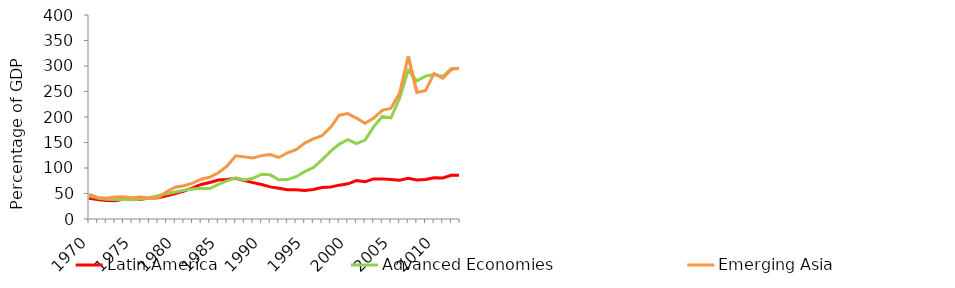
| Category | Latin America | Advanced Economies | Emerging Asia |
|---|---|---|---|
| 1970.0 | 40.739 | 45.427 | 48.295 |
| 1971.0 | 38.263 | 40.887 | 42.381 |
| 1972.0 | 36.474 | 38.635 | 40.748 |
| 1973.0 | 35.725 | 38.225 | 43.373 |
| 1974.0 | 38.863 | 38.237 | 43.654 |
| 1975.0 | 39.211 | 37.572 | 41.906 |
| 1976.0 | 38.292 | 39.385 | 43.041 |
| 1977.0 | 41.395 | 41.589 | 40.756 |
| 1978.0 | 41.713 | 45.764 | 41.584 |
| 1979.0 | 45.435 | 49.615 | 53.458 |
| 1980.0 | 49.704 | 53.043 | 62.329 |
| 1981.0 | 54.597 | 56.431 | 65.181 |
| 1982.0 | 60.89 | 58.783 | 70.415 |
| 1983.0 | 67.716 | 60.485 | 78.037 |
| 1984.0 | 71.686 | 59.729 | 81.986 |
| 1985.0 | 76.553 | 67.737 | 90.757 |
| 1986.0 | 77.595 | 74.651 | 103.715 |
| 1987.0 | 79.749 | 80.755 | 123.784 |
| 1988.0 | 75.418 | 76.571 | 121.798 |
| 1989.0 | 71.315 | 79.772 | 119.489 |
| 1990.0 | 67.733 | 87.733 | 124.307 |
| 1991.0 | 62.986 | 86.573 | 126.217 |
| 1992.0 | 60.257 | 76.962 | 120.651 |
| 1993.0 | 57.276 | 77.304 | 129.859 |
| 1994.0 | 57.257 | 82.847 | 135.964 |
| 1995.0 | 56.12 | 92.751 | 148.774 |
| 1996.0 | 57.702 | 100.89 | 157.235 |
| 1997.0 | 61.562 | 116.069 | 163.227 |
| 1998.0 | 62.747 | 132.473 | 179.86 |
| 1999.0 | 66.365 | 146.869 | 203.528 |
| 2000.0 | 69.038 | 155.525 | 206.737 |
| 2001.0 | 75.38 | 147.657 | 197.678 |
| 2002.0 | 73.01 | 154.612 | 187.831 |
| 2003.0 | 78.655 | 181.197 | 198.204 |
| 2004.0 | 78.675 | 201.101 | 213.113 |
| 2005.0 | 77.573 | 198.322 | 217.33 |
| 2006.0 | 76.013 | 236.576 | 247.088 |
| 2007.0 | 79.641 | 291.397 | 319.145 |
| 2008.0 | 76.4 | 271.017 | 248.206 |
| 2009.0 | 77.388 | 280.274 | 251.846 |
| 2010.0 | 80.967 | 283.327 | 285.194 |
| 2011.0 | 80.36 | 279.339 | 276.139 |
| 2012.0 | 85.87 | 295.111 | 293.119 |
| 2013.0 | 85.952 | 295.079 | 296.086 |